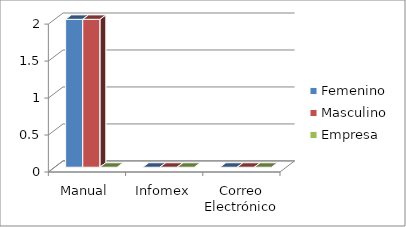
| Category | Femenino | Masculino | Empresa |
|---|---|---|---|
| 0 | 2 | 2 | 0 |
| 1 | 0 | 0 | 0 |
| 2 | 0 | 0 | 0 |